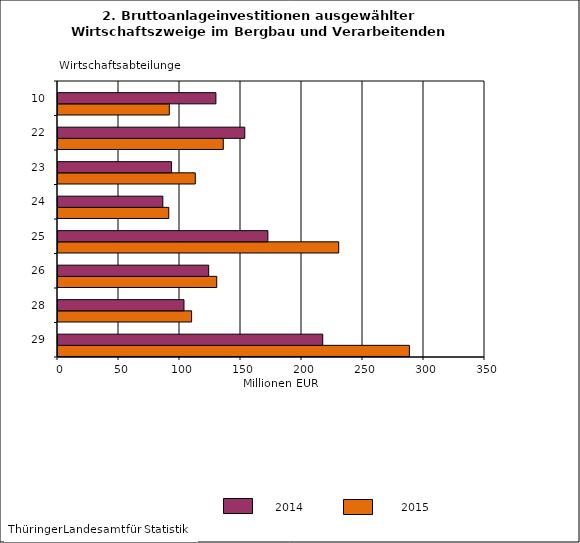
| Category | Berichtsjahr | Vorjahr | Series 2 |
|---|---|---|---|
| 0 | 288.035 | 216.995 |  |
| 1 | 109.511 | 103.262 |  |
| 2 | 130.117 | 123.507 |  |
| 3 | 230.098 | 172.037 |  |
| 4 | 90.797 | 85.927 |  |
| 5 | 112.545 | 93.062 |  |
| 6 | 135.498 | 153.108 |  |
| 7 | 91.236 | 129.432 |  |